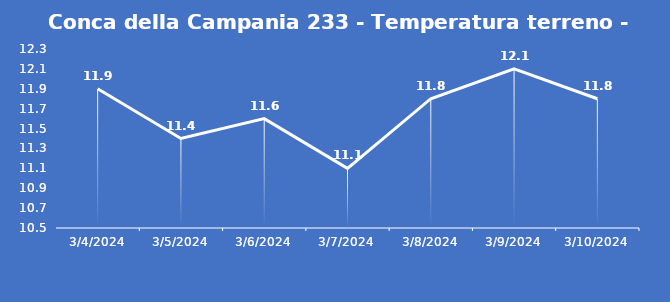
| Category | Conca della Campania 233 - Temperatura terreno - Grezzo (°C) |
|---|---|
| 3/4/24 | 11.9 |
| 3/5/24 | 11.4 |
| 3/6/24 | 11.6 |
| 3/7/24 | 11.1 |
| 3/8/24 | 11.8 |
| 3/9/24 | 12.1 |
| 3/10/24 | 11.8 |